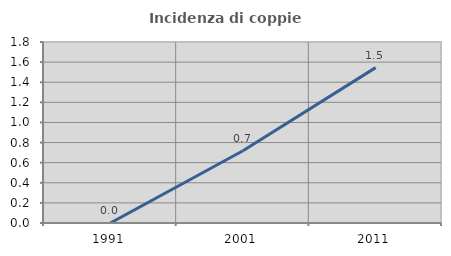
| Category | Incidenza di coppie miste |
|---|---|
| 1991.0 | 0 |
| 2001.0 | 0.718 |
| 2011.0 | 1.545 |